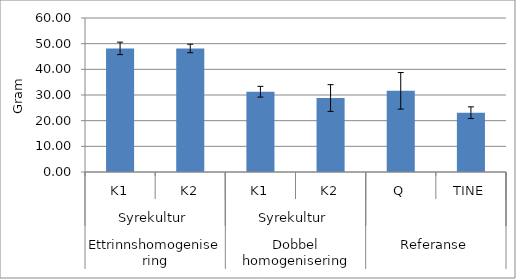
| Category | Series 0 |
|---|---|
| 0 | 48.155 |
| 1 | 48.132 |
| 2 | 31.275 |
| 3 | 28.824 |
| 4 | 31.63 |
| 5 | 23.1 |